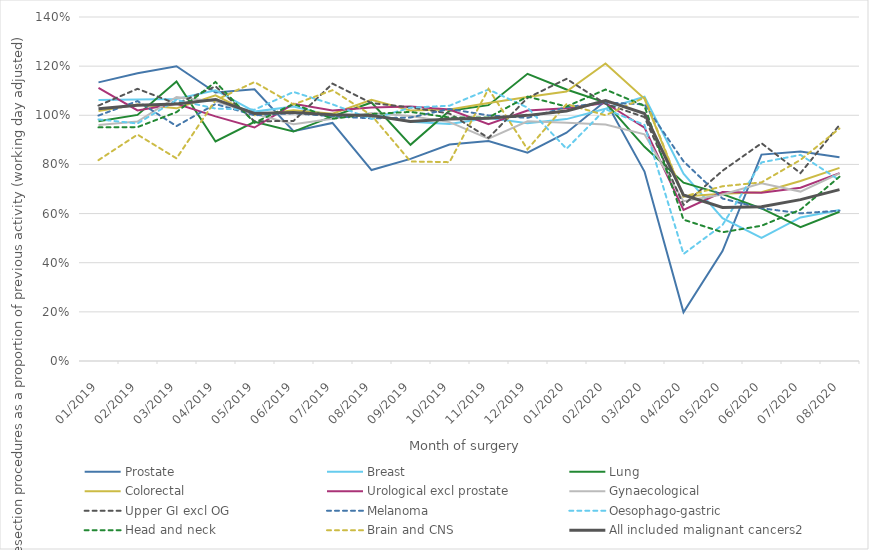
| Category | Prostate | Breast | Lung | Colorectal | Urological excl prostate | Gynaecological | Upper GI excl OG | Melanoma | Oesophago-gastric | Head and neck | Brain and CNS | All included malignant cancers2 |
|---|---|---|---|---|---|---|---|---|---|---|---|---|
| 2019-01-01 | 1.134 | 1.062 | 0.976 | 1.017 | 1.111 | 0.961 | 1.04 | 0.999 | 0.983 | 0.951 | 0.818 | 1.026 |
| 2019-02-01 | 1.171 | 1.064 | 1.002 | 1.044 | 1.02 | 0.975 | 1.108 | 1.058 | 0.967 | 0.952 | 0.921 | 1.041 |
| 2019-03-01 | 1.2 | 1.067 | 1.138 | 1.028 | 1.047 | 1.074 | 1.047 | 0.956 | 1.062 | 1.013 | 0.825 | 1.046 |
| 2019-04-01 | 1.093 | 1.102 | 0.893 | 1.082 | 0.996 | 1.056 | 1.118 | 1.046 | 1.027 | 1.136 | 1.061 | 1.065 |
| 2019-05-01 | 1.106 | 1.015 | 0.973 | 1.001 | 0.95 | 1.005 | 0.976 | 1 | 1.023 | 0.97 | 1.135 | 1.008 |
| 2019-06-01 | 0.935 | 1.035 | 0.934 | 1.02 | 1.047 | 0.963 | 0.977 | 1.008 | 1.095 | 1.046 | 1.044 | 1.011 |
| 2019-07-01 | 0.969 | 0.997 | 0.996 | 1.006 | 1.019 | 0.986 | 1.129 | 0.996 | 1.045 | 0.986 | 1.102 | 1.002 |
| 2019-08-01 | 0.777 | 1.004 | 1.052 | 1.063 | 1.032 | 1.01 | 1.05 | 0.987 | 0.985 | 1.005 | 1 | 0.999 |
| 2019-09-01 | 0.823 | 0.974 | 0.88 | 1.02 | 1.036 | 0.997 | 1.032 | 0.991 | 1.031 | 1.014 | 0.812 | 0.974 |
| 2019-10-01 | 0.881 | 0.964 | 1.019 | 1.023 | 1.024 | 0.972 | 1.007 | 1.026 | 1.039 | 0.991 | 0.809 | 0.985 |
| 2019-11-01 | 0.895 | 0.989 | 1.041 | 1.05 | 0.964 | 0.905 | 0.908 | 0.999 | 1.105 | 0.991 | 1.107 | 0.988 |
| 2019-12-01 | 0.848 | 0.968 | 1.169 | 1.074 | 1.019 | 0.975 | 1.071 | 0.989 | 1.031 | 1.076 | 0.862 | 1 |
| 2020-01-01 | 0.929 | 0.984 | 1.105 | 1.097 | 1.028 | 0.969 | 1.148 | 1.033 | 0.864 | 1.036 | 1.045 | 1.018 |
| 2020-02-01 | 1.058 | 1.027 | 1.052 | 1.211 | 1.05 | 0.962 | 1.047 | 1.052 | 1.025 | 1.105 | 1 | 1.06 |
| 2020-03-01 | 0.771 | 1.075 | 0.872 | 1.067 | 0.95 | 0.923 | 0.993 | 1.044 | 0.961 | 1.038 | 1.072 | 1.007 |
| 2020-04-01 | 0.199 | 0.763 | 0.726 | 0.669 | 0.615 | 0.651 | 0.635 | 0.813 | 0.436 | 0.575 | 0.669 | 0.675 |
| 2020-05-01 | 0.447 | 0.581 | 0.679 | 0.681 | 0.688 | 0.678 | 0.774 | 0.661 | 0.554 | 0.524 | 0.711 | 0.625 |
| 2020-06-01 | 0.84 | 0.501 | 0.621 | 0.687 | 0.684 | 0.724 | 0.886 | 0.622 | 0.808 | 0.55 | 0.727 | 0.628 |
| 2020-07-01 | 0.853 | 0.584 | 0.545 | 0.733 | 0.705 | 0.69 | 0.765 | 0.601 | 0.839 | 0.616 | 0.819 | 0.657 |
| 2020-08-01 | 0.829 | 0.615 | 0.607 | 0.786 | 0.765 | 0.764 | 0.961 | 0.612 | 0.736 | 0.75 | 0.946 | 0.697 |